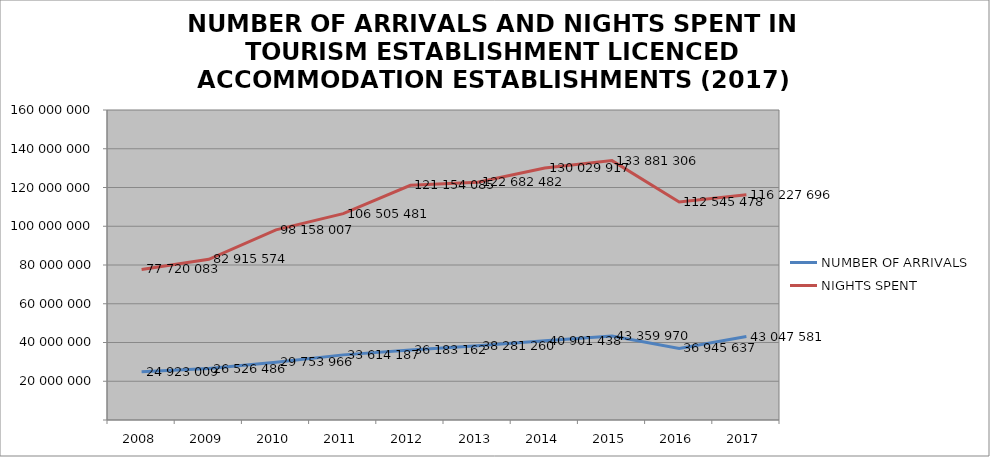
| Category | NUMBER OF ARRIVALS | NIGHTS SPENT |
|---|---|---|
| 2008 | 24923009 | 77720083 |
| 2009 | 26526486 | 82915574 |
| 2010 | 29753966 | 98158007 |
| 2011 | 33614187 | 106505481 |
| 2012 | 36183162 | 121154085 |
| 2013 | 38281260 | 122682482 |
| 2014 | 40901438 | 130029917 |
| 2015 | 43359970 | 133881306 |
| 2016 | 36945637 | 112545478 |
| 2017 | 43047581 | 116227696 |